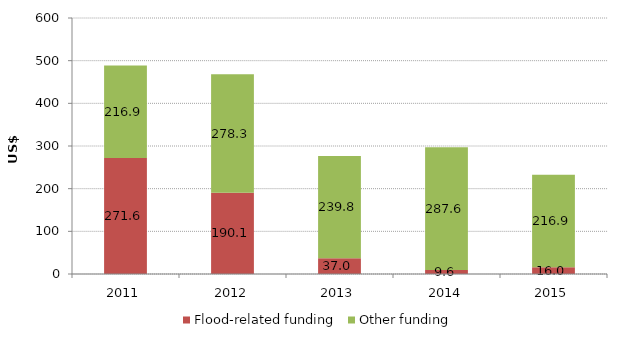
| Category | Flood-related funding | Other funding |
|---|---|---|
| 2011.0 | 271.619 | 216.859 |
| 2012.0 | 190.147 | 278.298 |
| 2013.0 | 36.975 | 239.833 |
| 2014.0 | 9.623 | 287.561 |
| 2015.0 | 15.952 | 216.914 |